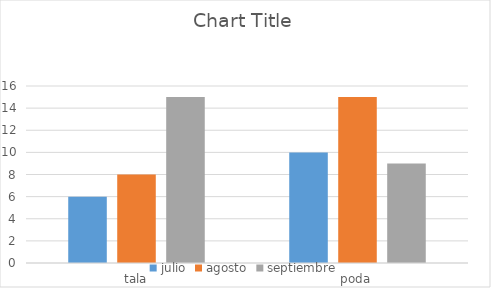
| Category | julio | agosto | septiembre |
|---|---|---|---|
| tala | 6 | 8 | 15 |
| poda | 10 | 15 | 9 |